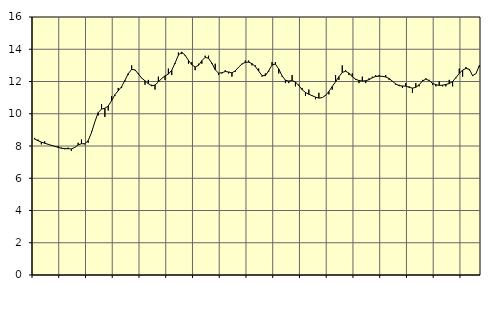
| Category | Piggar | Series 1 |
|---|---|---|
| nan | 8.5 | 8.42 |
| 87.0 | 8.4 | 8.33 |
| 87.0 | 8.1 | 8.24 |
| 87.0 | 8.3 | 8.17 |
| nan | 8.1 | 8.11 |
| 88.0 | 8 | 8.04 |
| 88.0 | 8 | 7.98 |
| 88.0 | 8 | 7.92 |
| nan | 7.9 | 7.86 |
| 89.0 | 7.8 | 7.84 |
| 89.0 | 7.9 | 7.83 |
| 89.0 | 7.7 | 7.82 |
| nan | 7.9 | 7.91 |
| 90.0 | 8.2 | 8.07 |
| 90.0 | 8.4 | 8.14 |
| 90.0 | 8.1 | 8.14 |
| nan | 8.2 | 8.33 |
| 91.0 | 8.9 | 8.83 |
| 91.0 | 9.5 | 9.5 |
| 91.0 | 9.9 | 10.07 |
| nan | 10.6 | 10.29 |
| 92.0 | 9.8 | 10.34 |
| 92.0 | 10.2 | 10.48 |
| 92.0 | 11.1 | 10.81 |
| nan | 11.1 | 11.18 |
| 93.0 | 11.6 | 11.43 |
| 93.0 | 11.6 | 11.68 |
| 93.0 | 12 | 12.07 |
| nan | 12.4 | 12.49 |
| 94.0 | 13 | 12.75 |
| 94.0 | 12.7 | 12.72 |
| 94.0 | 12.5 | 12.47 |
| nan | 12.2 | 12.22 |
| 95.0 | 11.8 | 12.04 |
| 95.0 | 12.1 | 11.87 |
| 95.0 | 11.8 | 11.73 |
| nan | 11.5 | 11.78 |
| 96.0 | 12.3 | 11.97 |
| 96.0 | 12.2 | 12.19 |
| 96.0 | 12.1 | 12.35 |
| nan | 12.8 | 12.46 |
| 97.0 | 12.4 | 12.7 |
| 97.0 | 13.1 | 13.15 |
| 97.0 | 13.8 | 13.64 |
| nan | 13.7 | 13.82 |
| 98.0 | 13.6 | 13.63 |
| 98.0 | 13.1 | 13.31 |
| 98.0 | 13.2 | 13.04 |
| nan | 12.7 | 12.9 |
| 99.0 | 13.1 | 13 |
| 99.0 | 13.1 | 13.29 |
| 99.0 | 13.6 | 13.5 |
| nan | 13.6 | 13.44 |
| 0.0 | 13.1 | 13.14 |
| 0.0 | 13.1 | 12.73 |
| 0.0 | 12.4 | 12.52 |
| nan | 12.5 | 12.54 |
| 1.0 | 12.7 | 12.62 |
| 1.0 | 12.5 | 12.59 |
| 1.0 | 12.3 | 12.54 |
| nan | 12.6 | 12.66 |
| 2.0 | 12.9 | 12.89 |
| 2.0 | 13.1 | 13.08 |
| 2.0 | 13.3 | 13.19 |
| nan | 13.3 | 13.2 |
| 3.0 | 13 | 13.11 |
| 3.0 | 13 | 12.93 |
| 3.0 | 12.8 | 12.65 |
| nan | 12.3 | 12.37 |
| 4.0 | 12.5 | 12.36 |
| 4.0 | 12.6 | 12.67 |
| 4.0 | 13.2 | 13.02 |
| nan | 13.2 | 13.08 |
| 5.0 | 12.5 | 12.78 |
| 5.0 | 12.3 | 12.35 |
| 5.0 | 11.9 | 12.08 |
| nan | 11.9 | 12.03 |
| 6.0 | 12.4 | 12.06 |
| 6.0 | 11.7 | 11.97 |
| 6.0 | 11.8 | 11.75 |
| nan | 11.6 | 11.49 |
| 7.0 | 11.1 | 11.32 |
| 7.0 | 11.5 | 11.21 |
| 7.0 | 11.1 | 11.12 |
| nan | 10.9 | 11.03 |
| 8.0 | 11.3 | 10.97 |
| 8.0 | 11 | 11 |
| 8.0 | 11.1 | 11.14 |
| nan | 11.2 | 11.38 |
| 9.0 | 11.5 | 11.69 |
| 9.0 | 12.4 | 11.98 |
| 9.0 | 12.1 | 12.3 |
| nan | 13 | 12.56 |
| 10.0 | 12.7 | 12.64 |
| 10.0 | 12.4 | 12.52 |
| 10.0 | 12.5 | 12.3 |
| nan | 12.1 | 12.14 |
| 11.0 | 11.9 | 12.06 |
| 11.0 | 12.3 | 12.03 |
| 11.0 | 11.9 | 12.05 |
| nan | 12.2 | 12.11 |
| 12.0 | 12.3 | 12.23 |
| 12.0 | 12.4 | 12.31 |
| 12.0 | 12.4 | 12.33 |
| nan | 12.3 | 12.32 |
| 13.0 | 12.4 | 12.28 |
| 13.0 | 12.1 | 12.19 |
| 13.0 | 12 | 12.02 |
| nan | 11.8 | 11.85 |
| 14.0 | 11.8 | 11.74 |
| 14.0 | 11.6 | 11.72 |
| 14.0 | 11.9 | 11.71 |
| nan | 11.7 | 11.64 |
| 15.0 | 11.3 | 11.59 |
| 15.0 | 11.9 | 11.64 |
| 15.0 | 11.7 | 11.8 |
| nan | 12.1 | 12.03 |
| 16.0 | 12.2 | 12.15 |
| 16.0 | 12.1 | 12.06 |
| 16.0 | 11.8 | 11.89 |
| nan | 11.7 | 11.8 |
| 17.0 | 12 | 11.76 |
| 17.0 | 11.7 | 11.77 |
| 17.0 | 11.7 | 11.82 |
| nan | 12.1 | 11.87 |
| 18.0 | 11.7 | 12 |
| 18.0 | 12.2 | 12.24 |
| 18.0 | 12.8 | 12.5 |
| nan | 12.3 | 12.71 |
| 19.0 | 12.9 | 12.81 |
| 19.0 | 12.7 | 12.76 |
| 19.0 | 12.4 | 12.36 |
| nan | 12.5 | 12.49 |
| 20.0 | 12.9 | 12.99 |